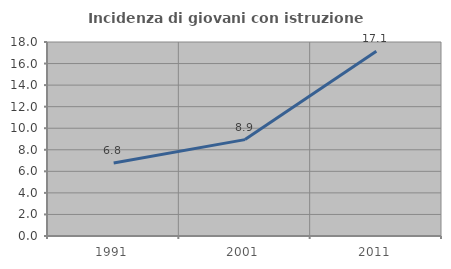
| Category | Incidenza di giovani con istruzione universitaria |
|---|---|
| 1991.0 | 6.78 |
| 2001.0 | 8.943 |
| 2011.0 | 17.143 |